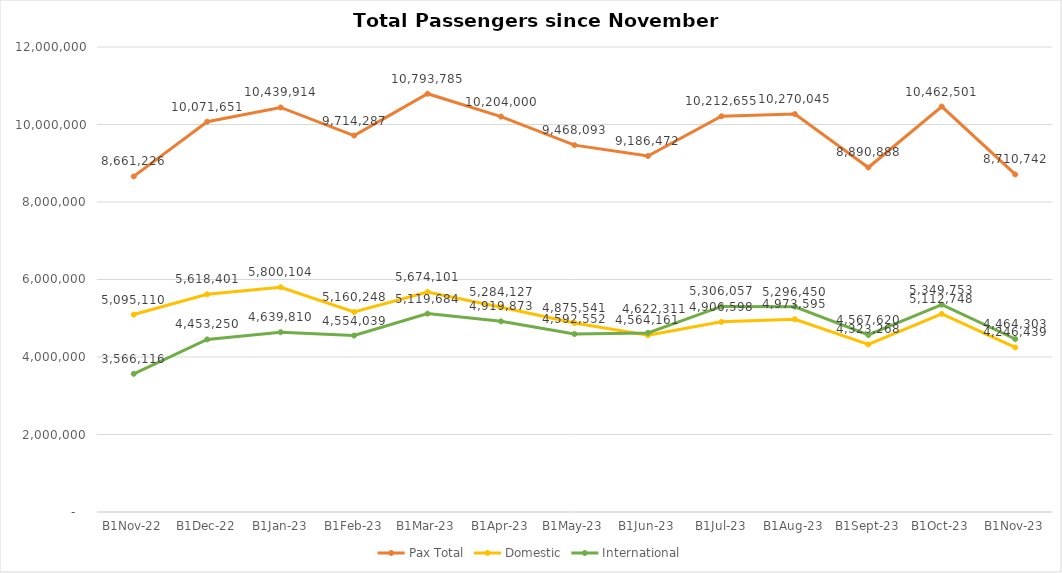
| Category | Pax Total | Domestic | International |
|---|---|---|---|
| 2022-11-01 | 8661226 | 5095110 | 3566116 |
| 2022-12-01 | 10071651 | 5618401 | 4453250 |
| 2023-01-01 | 10439914 | 5800104 | 4639810 |
| 2023-02-01 | 9714287 | 5160248 | 4554039 |
| 2023-03-01 | 10793785 | 5674101 | 5119684 |
| 2023-04-01 | 10204000 | 5284127 | 4919873 |
| 2023-05-01 | 9468093 | 4875541 | 4592552 |
| 2023-06-01 | 9186472 | 4564161 | 4622311 |
| 2023-07-01 | 10212655 | 4906598 | 5306057 |
| 2023-08-01 | 10270045 | 4973595 | 5296450 |
| 2023-09-01 | 8890888 | 4323268 | 4567620 |
| 2023-10-01 | 10462501 | 5112748 | 5349753 |
| 2023-11-01 | 8710742 | 4246439 | 4464303 |